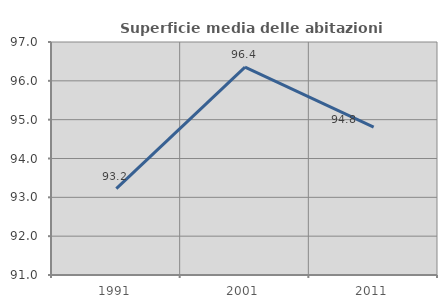
| Category | Superficie media delle abitazioni occupate |
|---|---|
| 1991.0 | 93.224 |
| 2001.0 | 96.354 |
| 2011.0 | 94.807 |